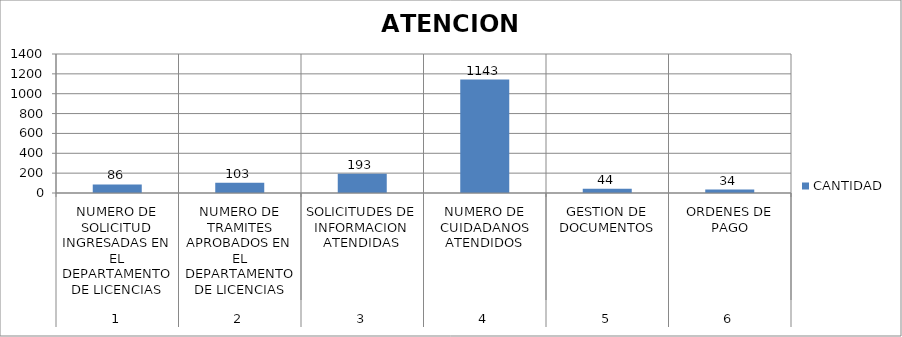
| Category | CANTIDAD |
|---|---|
| 0 | 86 |
| 1 | 103 |
| 2 | 193 |
| 3 | 1143 |
| 4 | 44 |
| 5 | 34 |